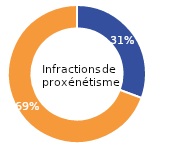
| Category | Infractions de proxénétisme |
|---|---|
| Femme | 30.66 |
| Homme | 69.34 |